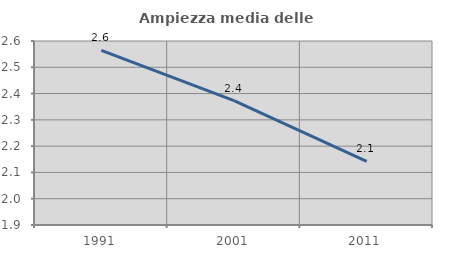
| Category | Ampiezza media delle famiglie |
|---|---|
| 1991.0 | 2.564 |
| 2001.0 | 2.373 |
| 2011.0 | 2.142 |